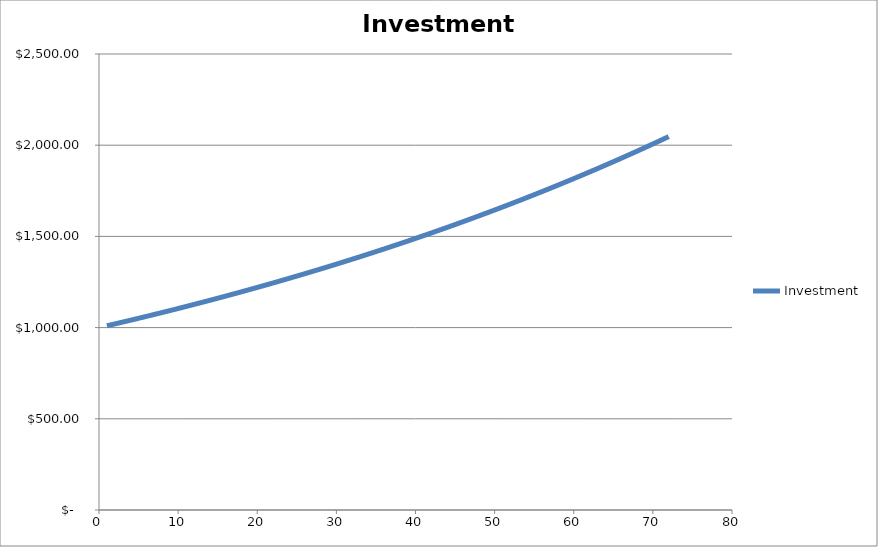
| Category | Investment |
|---|---|
| 1.0 | 1010 |
| 2.0 | 1020.1 |
| 3.0 | 1030.301 |
| 4.0 | 1040.604 |
| 5.0 | 1051.01 |
| 6.0 | 1061.52 |
| 7.0 | 1072.135 |
| 8.0 | 1082.857 |
| 9.0 | 1093.685 |
| 10.0 | 1104.622 |
| 11.0 | 1115.668 |
| 12.0 | 1126.825 |
| 13.0 | 1138.093 |
| 14.0 | 1149.474 |
| 15.0 | 1160.969 |
| 16.0 | 1172.579 |
| 17.0 | 1184.304 |
| 18.0 | 1196.147 |
| 19.0 | 1208.109 |
| 20.0 | 1220.19 |
| 21.0 | 1232.392 |
| 22.0 | 1244.716 |
| 23.0 | 1257.163 |
| 24.0 | 1269.735 |
| 25.0 | 1282.432 |
| 26.0 | 1295.256 |
| 27.0 | 1308.209 |
| 28.0 | 1321.291 |
| 29.0 | 1334.504 |
| 30.0 | 1347.849 |
| 31.0 | 1361.327 |
| 32.0 | 1374.941 |
| 33.0 | 1388.69 |
| 34.0 | 1402.577 |
| 35.0 | 1416.603 |
| 36.0 | 1430.769 |
| 37.0 | 1445.076 |
| 38.0 | 1459.527 |
| 39.0 | 1474.123 |
| 40.0 | 1488.864 |
| 41.0 | 1503.752 |
| 42.0 | 1518.79 |
| 43.0 | 1533.978 |
| 44.0 | 1549.318 |
| 45.0 | 1564.811 |
| 46.0 | 1580.459 |
| 47.0 | 1596.263 |
| 48.0 | 1612.226 |
| 49.0 | 1628.348 |
| 50.0 | 1644.632 |
| 51.0 | 1661.078 |
| 52.0 | 1677.689 |
| 53.0 | 1694.466 |
| 54.0 | 1711.41 |
| 55.0 | 1728.525 |
| 56.0 | 1745.81 |
| 57.0 | 1763.268 |
| 58.0 | 1780.901 |
| 59.0 | 1798.71 |
| 60.0 | 1816.697 |
| 61.0 | 1834.864 |
| 62.0 | 1853.212 |
| 63.0 | 1871.744 |
| 64.0 | 1890.462 |
| 65.0 | 1909.366 |
| 66.0 | 1928.46 |
| 67.0 | 1947.745 |
| 68.0 | 1967.222 |
| 69.0 | 1986.894 |
| 70.0 | 2006.763 |
| 71.0 | 2026.831 |
| 72.0 | 2047.099 |